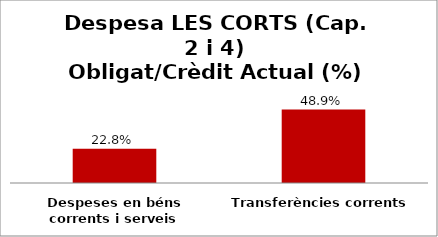
| Category | Series 0 |
|---|---|
| Despeses en béns corrents i serveis | 0.228 |
| Transferències corrents | 0.489 |